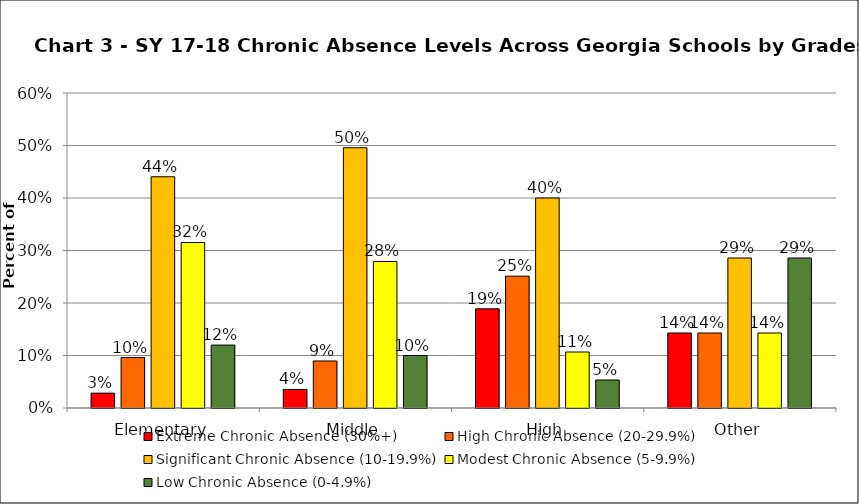
| Category | Extreme Chronic Absence (30%+) | High Chronic Absence (20-29.9%) | Significant Chronic Absence (10-19.9%) | Modest Chronic Absence (5-9.9%) | Low Chronic Absence (0-4.9%) |
|---|---|---|---|---|---|
| 0 | 0.028 | 0.096 | 0.44 | 0.315 | 0.12 |
| 1 | 0.035 | 0.09 | 0.496 | 0.279 | 0.1 |
| 2 | 0.189 | 0.251 | 0.4 | 0.107 | 0.053 |
| 3 | 0.143 | 0.143 | 0.286 | 0.143 | 0.286 |